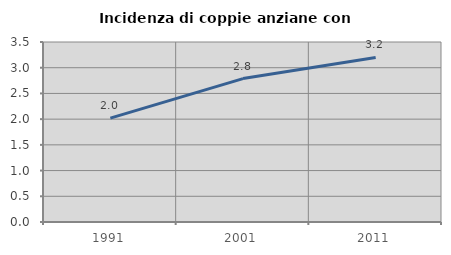
| Category | Incidenza di coppie anziane con figli |
|---|---|
| 1991.0 | 2.019 |
| 2001.0 | 2.789 |
| 2011.0 | 3.201 |